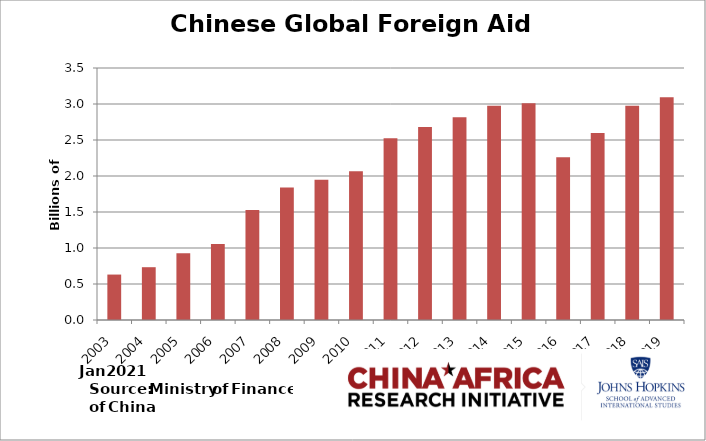
| Category | Foreign Aid |
|---|---|
| 2003.0 | 0.631 |
| 2004.0 | 0.733 |
| 2005.0 | 0.926 |
| 2006.0 | 1.055 |
| 2007.0 | 1.529 |
| 2008.0 | 1.84 |
| 2009.0 | 1.948 |
| 2010.0 | 2.066 |
| 2011.0 | 2.524 |
| 2012.0 | 2.679 |
| 2013.0 | 2.816 |
| 2014.0 | 2.975 |
| 2015.0 | 3.009 |
| 2016.0 | 2.262 |
| 2017.0 | 2.597 |
| 2018.0 | 2.974 |
| 2019.0 | 3.095 |